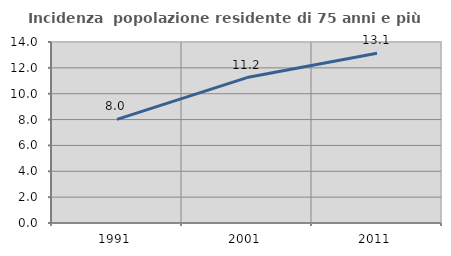
| Category | Incidenza  popolazione residente di 75 anni e più |
|---|---|
| 1991.0 | 8.017 |
| 2001.0 | 11.247 |
| 2011.0 | 13.123 |